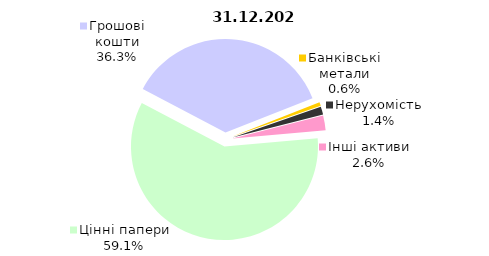
| Category | Всього |
|---|---|
| Цінні папери | 1399.481 |
| Грошові кошти | 859.613 |
| Банківські метали | 14.73 |
| Нерухомість | 32.61 |
| Інші активи | 61.105 |